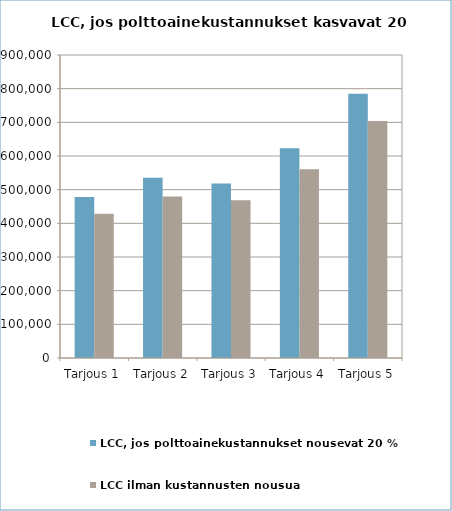
| Category | LCC, jos polttoainekustannukset nousevat 20 % | LCC ilman kustannusten nousua |
|---|---|---|
| Tarjous 1 | 478367.838 | 428639.865 |
| Tarjous 2 | 535663.817 | 479719.848 |
| Tarjous 3 | 518367.838 | 468639.865 |
| Tarjous 4 | 622959.797 | 560799.831 |
| Tarjous 5 | 784847.736 | 704039.78 |